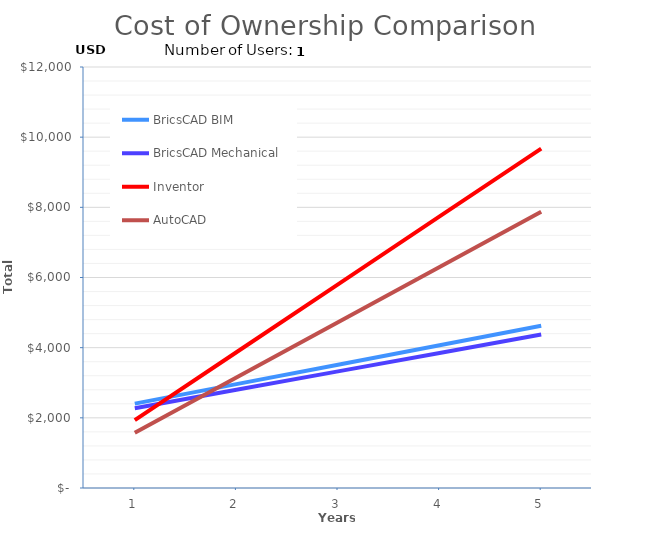
| Category |  BricsCAD BIM  |  BricsCAD Mechanical  |  Inventor  |  AutoCAD  |
|---|---|---|---|---|
| 1.0 | 2405 | 2275 | 1935 | 1575 |
| 2.0 | 2960 | 2800 | 3870 | 3150 |
| 3.0 | 3515 | 3325 | 5805 | 4725 |
| 4.0 | 4070 | 3850 | 7740 | 6300 |
| 5.0 | 4625 | 4375 | 9675 | 7875 |